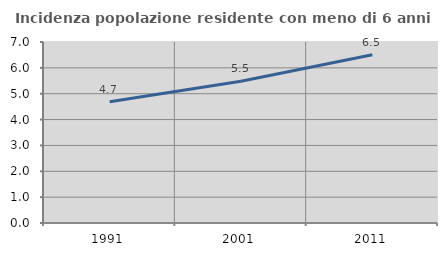
| Category | Incidenza popolazione residente con meno di 6 anni |
|---|---|
| 1991.0 | 4.691 |
| 2001.0 | 5.481 |
| 2011.0 | 6.504 |